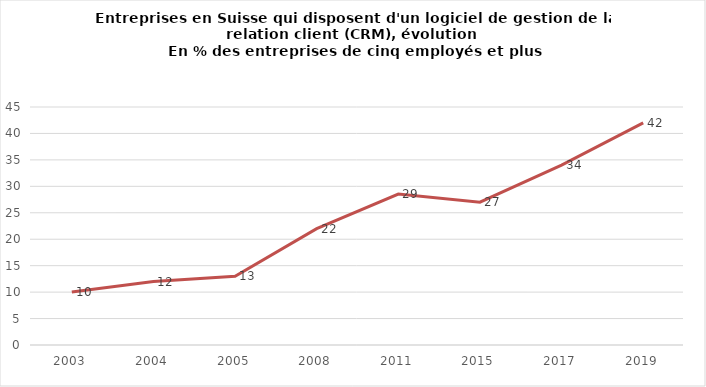
| Category | % |
|---|---|
| 2003.0 | 10 |
| 2004.0 | 12 |
| 2005.0 | 13 |
| 2008.0 | 22 |
| 2011.0 | 28.543 |
| 2015.0 | 27 |
| 2017.0 | 34 |
| 2019.0 | 42 |